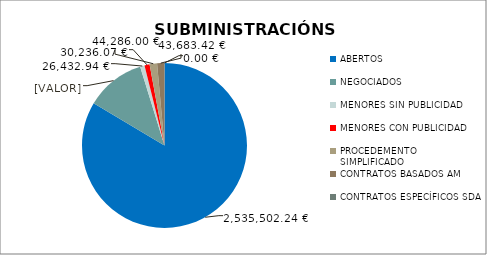
| Category | Series 0 |
|---|---|
| ABERTOS  | 2535502.24 |
| NEGOCIADOS  | 353804 |
| MENORES SIN PUBLICIDAD | 26432.94 |
| MENORES CON PUBLICIDAD | 30236.07 |
| PROCEDEMENTO SIMPLIFICADO | 44286 |
| CONTRATOS BASADOS AM | 43683.42 |
| CONTRATOS ESPECÍFICOS SDA | 0 |